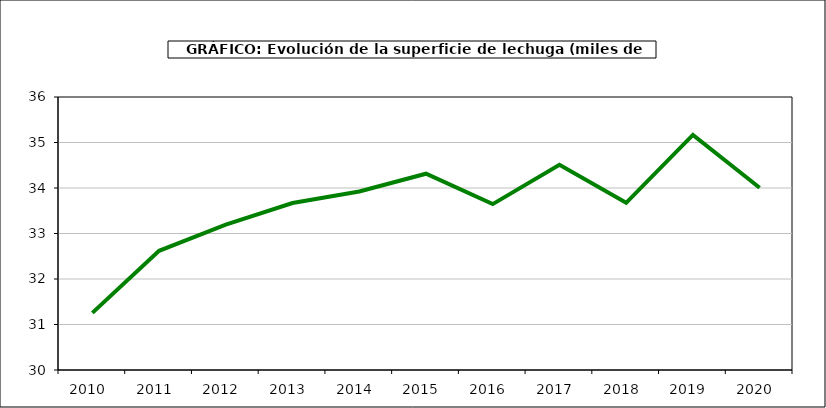
| Category | superficie |
|---|---|
| 2010.0 | 31.256 |
| 2011.0 | 32.62 |
| 2012.0 | 33.196 |
| 2013.0 | 33.669 |
| 2014.0 | 33.924 |
| 2015.0 | 34.314 |
| 2016.0 | 33.646 |
| 2017.0 | 34.508 |
| 2018.0 | 33.674 |
| 2019.0 | 35.168 |
| 2020.0 | 34.005 |